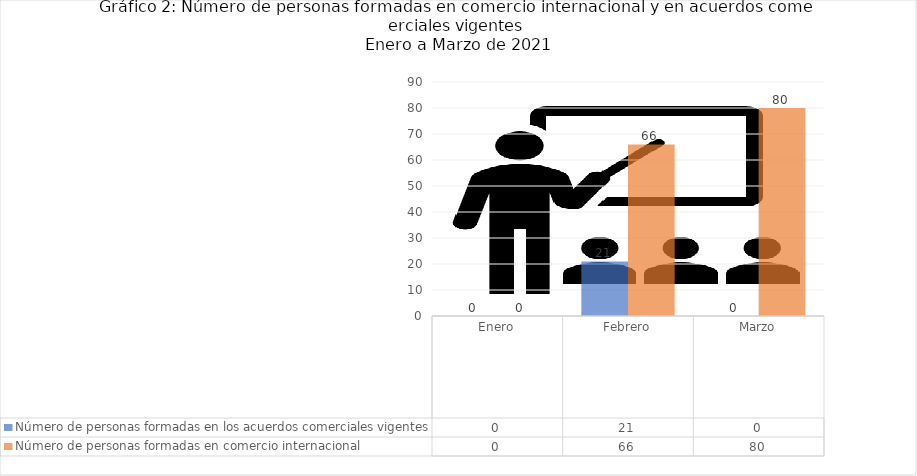
| Category | Número de personas formadas en los acuerdos comerciales vigentes | Número de personas formadas en comercio internacional  |
|---|---|---|
| Enero | 0 | 0 |
| Febrero | 21 | 66 |
| Marzo | 0 | 80 |